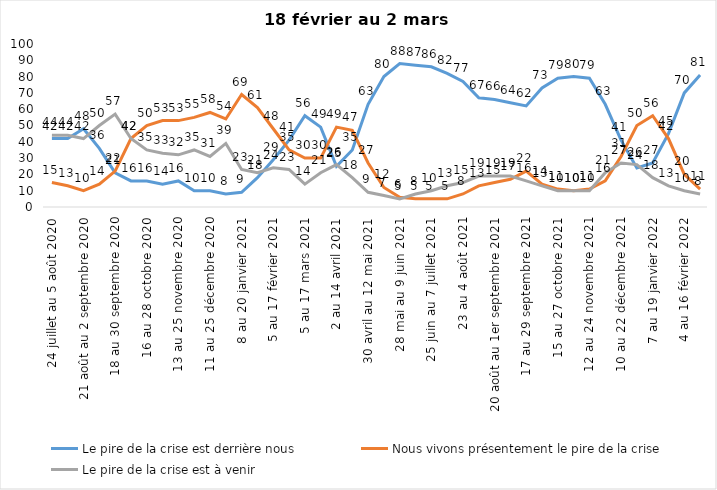
| Category | Le pire de la crise est derrière nous | Nous vivons présentement le pire de la crise | Le pire de la crise est à venir |
|---|---|---|---|
| 24 juillet au 5 août 2020 | 42 | 15 | 44 |
| 7 au 19 août 2020 | 42 | 13 | 44 |
| 21 août au 2 septembre 2020 | 48 | 10 | 42 |
| 4 au 16 septembre 2020 | 36 | 14 | 50 |
| 18 au 30 septembre 2020 | 21 | 22 | 57 |
| 2 au 14 octobre 2020 | 16 | 42 | 42 |
| 16 au 28 octobre 2020 | 16 | 50 | 35 |
| 30 octobre au 11 novembre 2020 | 14 | 53 | 33 |
| 13 au 25 novembre 2020 | 16 | 53 | 32 |
| 27 au 9 décembre 2020 | 10 | 55 | 35 |
| 11 au 25 décembre 2020 | 10 | 58 | 31 |
| 25 décembre 2020 au 6 janvier 2021 | 8 | 54 | 39 |
| 8 au 20 janvier 2021 | 9 | 69 | 23 |
| 22 janvier au 3 février 2021 | 18 | 61 | 21 |
| 5 au 17 février 2021 | 29 | 48 | 24 |
| 19 février au 3 mars 2021 | 41 | 35 | 23 |
| 5 au 17 mars 2021 | 56 | 30 | 14 |
| 19 au 31 mars 2021 | 49 | 30 | 21 |
| 2 au 14 avril 2021 | 25 | 49 | 26 |
| 16 au 28 avril 2021 | 35 | 47 | 18 |
| 30 avril au 12 mai 2021 | 63 | 27 | 9 |
| 14 au 26 mai 2021 | 80 | 12 | 7 |
| 28 mai au 9 juin 2021 | 88 | 6 | 5 |
| 11 au 23 juin 2021 | 87 | 5 | 8 |
| 25 juin au 7 juillet 2021 | 86 | 5 | 10 |
| 9 au 21 juillet 2021 | 82 | 5 | 13 |
| 23 au 4 août 2021 | 77 | 8 | 15 |
| 6 au 18 août 2021 | 67 | 13 | 19 |
| 20 août au 1er septembre 2021 | 66 | 15 | 19 |
| 3 au 15 septembre 2021 | 64 | 17 | 19 |
| 17 au 29 septembre 2021 | 62 | 22 | 16 |
| 1 au 13 octobre 2021 | 73 | 14 | 13 |
| 15 au 27 octobre 2021 | 79 | 11 | 10 |
| 29 octobre au 10 novembre 2021 | 80 | 10 | 10 |
| 12 au 24 novembre 2021 | 79 | 11 | 10 |
| 26 novembre au 8 décembre 2021 | 63 | 16 | 21 |
| 10 au 22 décembre 2021 | 41 | 31 | 27 |
| 24 décembre 2021 au 5 janvier 2022 2022 | 24 | 50 | 26 |
| 7 au 19 janvier 2022 | 27 | 56 | 18 |
| 21 janvier au 2 février 2022 | 45 | 42 | 13 |
| 4 au 16 février 2022 | 70 | 20 | 10 |
| 18 février au 2 mars  2022 | 81 | 11 | 8 |